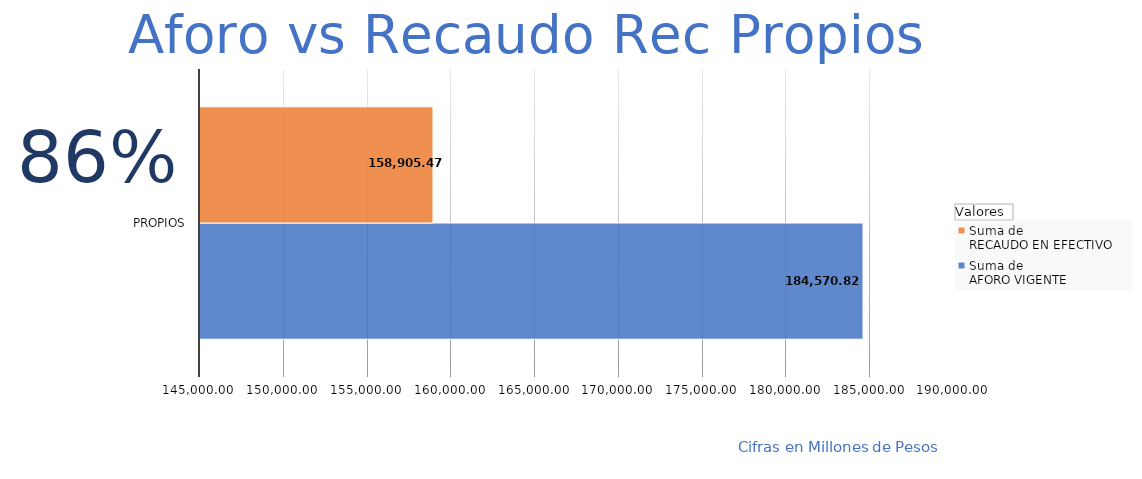
| Category | Suma de 
AFORO VIGENTE
 | Suma de 
RECAUDO EN EFECTIVO 
 |
|---|---|---|
| Propios | 184570.824 | 158905.465 |